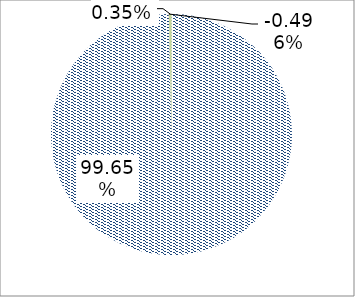
| Category | Series 0 |
|---|---|
| Fixed-line phone | 422425529.323 |
| Cable Modem | 0 |
| DSL | 0 |
| FTTH/B | 0 |
| Other Internet | 16000 |
| 1G mobile analog  | 1472155.811 |
| 2 G mobile | 0 |
| 2.5G mobile | 0 |
| 3G mobile | 0 |